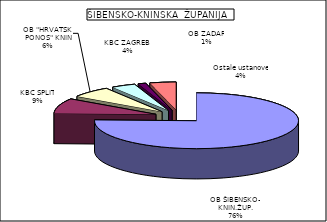
| Category | Series 0 |
|---|---|
| OB ŠIBENSKO– KNIN.ŽUP. | 75.501 |
| KBC SPLIT | 8.796 |
| OB "HRVATSKI PONOS" KNIN | 6.496 |
| KBC ZAGREB  | 3.802 |
| OB ZADAR | 1.242 |
| Ostale ustanove | 4.163 |